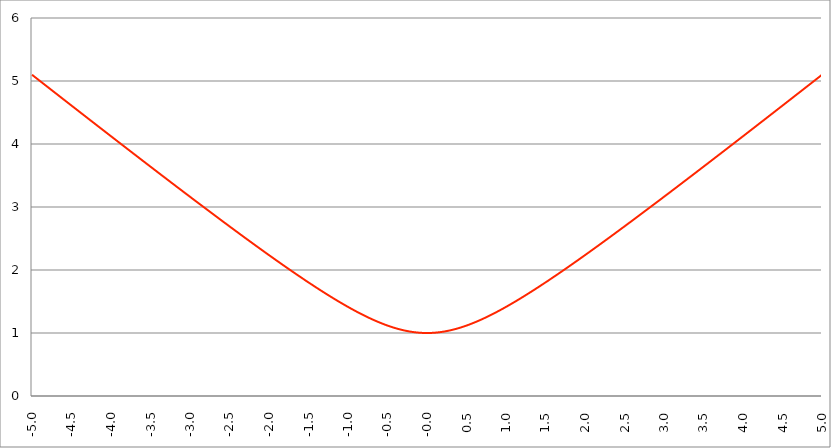
| Category | Series 1 |
|---|---|
| -5.0 | 5.099 |
| -4.995 | 5.094 |
| -4.99 | 5.089 |
| -4.985 | 5.084 |
| -4.98 | 5.079 |
| -4.975 | 5.075 |
| -4.97 | 5.07 |
| -4.965000000000001 | 5.065 |
| -4.960000000000001 | 5.06 |
| -4.955000000000001 | 5.055 |
| -4.950000000000001 | 5.05 |
| -4.945000000000001 | 5.045 |
| -4.940000000000001 | 5.04 |
| -4.935000000000001 | 5.035 |
| -4.930000000000001 | 5.03 |
| -4.925000000000002 | 5.025 |
| -4.920000000000002 | 5.021 |
| -4.915000000000002 | 5.016 |
| -4.910000000000002 | 5.011 |
| -4.905000000000002 | 5.006 |
| -4.900000000000002 | 5.001 |
| -4.895000000000002 | 4.996 |
| -4.890000000000002 | 4.991 |
| -4.885000000000002 | 4.986 |
| -4.880000000000002 | 4.981 |
| -4.875000000000003 | 4.977 |
| -4.870000000000003 | 4.972 |
| -4.865000000000003 | 4.967 |
| -4.860000000000003 | 4.962 |
| -4.855000000000003 | 4.957 |
| -4.850000000000003 | 4.952 |
| -4.845000000000003 | 4.947 |
| -4.840000000000003 | 4.942 |
| -4.835000000000003 | 4.937 |
| -4.830000000000004 | 4.932 |
| -4.825000000000004 | 4.928 |
| -4.820000000000004 | 4.923 |
| -4.815000000000004 | 4.918 |
| -4.810000000000004 | 4.913 |
| -4.805000000000004 | 4.908 |
| -4.800000000000004 | 4.903 |
| -4.795000000000004 | 4.898 |
| -4.790000000000004 | 4.893 |
| -4.785000000000004 | 4.888 |
| -4.780000000000004 | 4.883 |
| -4.775000000000004 | 4.879 |
| -4.770000000000004 | 4.874 |
| -4.765000000000005 | 4.869 |
| -4.760000000000005 | 4.864 |
| -4.755000000000005 | 4.859 |
| -4.750000000000005 | 4.854 |
| -4.745000000000005 | 4.849 |
| -4.740000000000005 | 4.844 |
| -4.735000000000005 | 4.839 |
| -4.730000000000005 | 4.835 |
| -4.725000000000006 | 4.83 |
| -4.720000000000006 | 4.825 |
| -4.715000000000006 | 4.82 |
| -4.710000000000006 | 4.815 |
| -4.705000000000006 | 4.81 |
| -4.700000000000006 | 4.805 |
| -4.695000000000006 | 4.8 |
| -4.690000000000006 | 4.795 |
| -4.685000000000007 | 4.791 |
| -4.680000000000007 | 4.786 |
| -4.675000000000007 | 4.781 |
| -4.670000000000007 | 4.776 |
| -4.665000000000007 | 4.771 |
| -4.660000000000007 | 4.766 |
| -4.655000000000007 | 4.761 |
| -4.650000000000007 | 4.756 |
| -4.645000000000007 | 4.751 |
| -4.640000000000008 | 4.747 |
| -4.635000000000008 | 4.742 |
| -4.630000000000008 | 4.737 |
| -4.625000000000008 | 4.732 |
| -4.620000000000008 | 4.727 |
| -4.615000000000008 | 4.722 |
| -4.610000000000008 | 4.717 |
| -4.605000000000008 | 4.712 |
| -4.600000000000008 | 4.707 |
| -4.595000000000009 | 4.703 |
| -4.590000000000009 | 4.698 |
| -4.585000000000009 | 4.693 |
| -4.580000000000009 | 4.688 |
| -4.57500000000001 | 4.683 |
| -4.57000000000001 | 4.678 |
| -4.565000000000009 | 4.673 |
| -4.560000000000009 | 4.668 |
| -4.555000000000009 | 4.663 |
| -4.55000000000001 | 4.659 |
| -4.54500000000001 | 4.654 |
| -4.54000000000001 | 4.649 |
| -4.53500000000001 | 4.644 |
| -4.53000000000001 | 4.639 |
| -4.52500000000001 | 4.634 |
| -4.52000000000001 | 4.629 |
| -4.51500000000001 | 4.624 |
| -4.51000000000001 | 4.62 |
| -4.505000000000011 | 4.615 |
| -4.500000000000011 | 4.61 |
| -4.495000000000011 | 4.605 |
| -4.490000000000011 | 4.6 |
| -4.485000000000011 | 4.595 |
| -4.480000000000011 | 4.59 |
| -4.475000000000011 | 4.585 |
| -4.470000000000011 | 4.58 |
| -4.465000000000011 | 4.576 |
| -4.460000000000011 | 4.571 |
| -4.455000000000012 | 4.566 |
| -4.450000000000012 | 4.561 |
| -4.445000000000012 | 4.556 |
| -4.440000000000012 | 4.551 |
| -4.435000000000012 | 4.546 |
| -4.430000000000012 | 4.541 |
| -4.425000000000012 | 4.537 |
| -4.420000000000012 | 4.532 |
| -4.415000000000012 | 4.527 |
| -4.410000000000013 | 4.522 |
| -4.405000000000013 | 4.517 |
| -4.400000000000013 | 4.512 |
| -4.395000000000013 | 4.507 |
| -4.390000000000013 | 4.502 |
| -4.385000000000013 | 4.498 |
| -4.380000000000013 | 4.493 |
| -4.375000000000013 | 4.488 |
| -4.370000000000013 | 4.483 |
| -4.365000000000013 | 4.478 |
| -4.360000000000014 | 4.473 |
| -4.355000000000014 | 4.468 |
| -4.350000000000014 | 4.463 |
| -4.345000000000014 | 4.459 |
| -4.340000000000014 | 4.454 |
| -4.335000000000014 | 4.449 |
| -4.330000000000014 | 4.444 |
| -4.325000000000014 | 4.439 |
| -4.320000000000014 | 4.434 |
| -4.315000000000015 | 4.429 |
| -4.310000000000015 | 4.424 |
| -4.305000000000015 | 4.42 |
| -4.300000000000015 | 4.415 |
| -4.295000000000015 | 4.41 |
| -4.290000000000015 | 4.405 |
| -4.285000000000015 | 4.4 |
| -4.280000000000015 | 4.395 |
| -4.275000000000015 | 4.39 |
| -4.270000000000015 | 4.386 |
| -4.265000000000016 | 4.381 |
| -4.260000000000016 | 4.376 |
| -4.255000000000016 | 4.371 |
| -4.250000000000016 | 4.366 |
| -4.245000000000016 | 4.361 |
| -4.240000000000016 | 4.356 |
| -4.235000000000016 | 4.351 |
| -4.230000000000016 | 4.347 |
| -4.225000000000017 | 4.342 |
| -4.220000000000017 | 4.337 |
| -4.215000000000017 | 4.332 |
| -4.210000000000017 | 4.327 |
| -4.205000000000017 | 4.322 |
| -4.200000000000017 | 4.317 |
| -4.195000000000017 | 4.313 |
| -4.190000000000017 | 4.308 |
| -4.185000000000017 | 4.303 |
| -4.180000000000017 | 4.298 |
| -4.175000000000018 | 4.293 |
| -4.170000000000018 | 4.288 |
| -4.165000000000018 | 4.283 |
| -4.160000000000018 | 4.279 |
| -4.155000000000018 | 4.274 |
| -4.150000000000018 | 4.269 |
| -4.145000000000018 | 4.264 |
| -4.140000000000018 | 4.259 |
| -4.135000000000018 | 4.254 |
| -4.130000000000019 | 4.249 |
| -4.125000000000019 | 4.244 |
| -4.120000000000019 | 4.24 |
| -4.115000000000019 | 4.235 |
| -4.110000000000019 | 4.23 |
| -4.105000000000019 | 4.225 |
| -4.100000000000019 | 4.22 |
| -4.095000000000019 | 4.215 |
| -4.090000000000019 | 4.21 |
| -4.085000000000019 | 4.206 |
| -4.08000000000002 | 4.201 |
| -4.07500000000002 | 4.196 |
| -4.07000000000002 | 4.191 |
| -4.06500000000002 | 4.186 |
| -4.06000000000002 | 4.181 |
| -4.05500000000002 | 4.176 |
| -4.05000000000002 | 4.172 |
| -4.04500000000002 | 4.167 |
| -4.04000000000002 | 4.162 |
| -4.03500000000002 | 4.157 |
| -4.03000000000002 | 4.152 |
| -4.025000000000021 | 4.147 |
| -4.020000000000021 | 4.143 |
| -4.015000000000021 | 4.138 |
| -4.010000000000021 | 4.133 |
| -4.005000000000021 | 4.128 |
| -4.000000000000021 | 4.123 |
| -3.995000000000021 | 4.118 |
| -3.990000000000021 | 4.113 |
| -3.985000000000022 | 4.109 |
| -3.980000000000022 | 4.104 |
| -3.975000000000022 | 4.099 |
| -3.970000000000022 | 4.094 |
| -3.965000000000022 | 4.089 |
| -3.960000000000022 | 4.084 |
| -3.955000000000022 | 4.079 |
| -3.950000000000022 | 4.075 |
| -3.945000000000022 | 4.07 |
| -3.940000000000023 | 4.065 |
| -3.935000000000023 | 4.06 |
| -3.930000000000023 | 4.055 |
| -3.925000000000023 | 4.05 |
| -3.920000000000023 | 4.046 |
| -3.915000000000023 | 4.041 |
| -3.910000000000023 | 4.036 |
| -3.905000000000023 | 4.031 |
| -3.900000000000023 | 4.026 |
| -3.895000000000023 | 4.021 |
| -3.890000000000024 | 4.016 |
| -3.885000000000024 | 4.012 |
| -3.880000000000024 | 4.007 |
| -3.875000000000024 | 4.002 |
| -3.870000000000024 | 3.997 |
| -3.865000000000024 | 3.992 |
| -3.860000000000024 | 3.987 |
| -3.855000000000024 | 3.983 |
| -3.850000000000024 | 3.978 |
| -3.845000000000025 | 3.973 |
| -3.840000000000025 | 3.968 |
| -3.835000000000025 | 3.963 |
| -3.830000000000025 | 3.958 |
| -3.825000000000025 | 3.954 |
| -3.820000000000025 | 3.949 |
| -3.815000000000025 | 3.944 |
| -3.810000000000025 | 3.939 |
| -3.805000000000025 | 3.934 |
| -3.800000000000026 | 3.929 |
| -3.795000000000026 | 3.925 |
| -3.790000000000026 | 3.92 |
| -3.785000000000026 | 3.915 |
| -3.780000000000026 | 3.91 |
| -3.775000000000026 | 3.905 |
| -3.770000000000026 | 3.9 |
| -3.765000000000026 | 3.896 |
| -3.760000000000026 | 3.891 |
| -3.755000000000026 | 3.886 |
| -3.750000000000027 | 3.881 |
| -3.745000000000027 | 3.876 |
| -3.740000000000027 | 3.871 |
| -3.735000000000027 | 3.867 |
| -3.730000000000027 | 3.862 |
| -3.725000000000027 | 3.857 |
| -3.720000000000027 | 3.852 |
| -3.715000000000027 | 3.847 |
| -3.710000000000027 | 3.842 |
| -3.705000000000028 | 3.838 |
| -3.700000000000028 | 3.833 |
| -3.695000000000028 | 3.828 |
| -3.690000000000028 | 3.823 |
| -3.685000000000028 | 3.818 |
| -3.680000000000028 | 3.813 |
| -3.675000000000028 | 3.809 |
| -3.670000000000028 | 3.804 |
| -3.665000000000028 | 3.799 |
| -3.660000000000028 | 3.794 |
| -3.655000000000029 | 3.789 |
| -3.650000000000029 | 3.785 |
| -3.645000000000029 | 3.78 |
| -3.640000000000029 | 3.775 |
| -3.635000000000029 | 3.77 |
| -3.630000000000029 | 3.765 |
| -3.625000000000029 | 3.76 |
| -3.620000000000029 | 3.756 |
| -3.615000000000029 | 3.751 |
| -3.61000000000003 | 3.746 |
| -3.60500000000003 | 3.741 |
| -3.60000000000003 | 3.736 |
| -3.59500000000003 | 3.731 |
| -3.59000000000003 | 3.727 |
| -3.58500000000003 | 3.722 |
| -3.58000000000003 | 3.717 |
| -3.57500000000003 | 3.712 |
| -3.57000000000003 | 3.707 |
| -3.565000000000031 | 3.703 |
| -3.560000000000031 | 3.698 |
| -3.555000000000031 | 3.693 |
| -3.550000000000031 | 3.688 |
| -3.545000000000031 | 3.683 |
| -3.540000000000031 | 3.679 |
| -3.535000000000031 | 3.674 |
| -3.530000000000031 | 3.669 |
| -3.525000000000031 | 3.664 |
| -3.520000000000032 | 3.659 |
| -3.515000000000032 | 3.654 |
| -3.510000000000032 | 3.65 |
| -3.505000000000032 | 3.645 |
| -3.500000000000032 | 3.64 |
| -3.495000000000032 | 3.635 |
| -3.490000000000032 | 3.63 |
| -3.485000000000032 | 3.626 |
| -3.480000000000032 | 3.621 |
| -3.475000000000032 | 3.616 |
| -3.470000000000033 | 3.611 |
| -3.465000000000033 | 3.606 |
| -3.460000000000033 | 3.602 |
| -3.455000000000033 | 3.597 |
| -3.450000000000033 | 3.592 |
| -3.445000000000033 | 3.587 |
| -3.440000000000033 | 3.582 |
| -3.435000000000033 | 3.578 |
| -3.430000000000033 | 3.573 |
| -3.425000000000034 | 3.568 |
| -3.420000000000034 | 3.563 |
| -3.415000000000034 | 3.558 |
| -3.410000000000034 | 3.554 |
| -3.405000000000034 | 3.549 |
| -3.400000000000034 | 3.544 |
| -3.395000000000034 | 3.539 |
| -3.390000000000034 | 3.534 |
| -3.385000000000034 | 3.53 |
| -3.380000000000034 | 3.525 |
| -3.375000000000035 | 3.52 |
| -3.370000000000035 | 3.515 |
| -3.365000000000035 | 3.51 |
| -3.360000000000035 | 3.506 |
| -3.355000000000035 | 3.501 |
| -3.350000000000035 | 3.496 |
| -3.345000000000035 | 3.491 |
| -3.340000000000035 | 3.486 |
| -3.335000000000035 | 3.482 |
| -3.330000000000036 | 3.477 |
| -3.325000000000036 | 3.472 |
| -3.320000000000036 | 3.467 |
| -3.315000000000036 | 3.463 |
| -3.310000000000036 | 3.458 |
| -3.305000000000036 | 3.453 |
| -3.300000000000036 | 3.448 |
| -3.295000000000036 | 3.443 |
| -3.290000000000036 | 3.439 |
| -3.285000000000036 | 3.434 |
| -3.280000000000036 | 3.429 |
| -3.275000000000037 | 3.424 |
| -3.270000000000037 | 3.419 |
| -3.265000000000037 | 3.415 |
| -3.260000000000037 | 3.41 |
| -3.255000000000037 | 3.405 |
| -3.250000000000037 | 3.4 |
| -3.245000000000037 | 3.396 |
| -3.240000000000037 | 3.391 |
| -3.235000000000038 | 3.386 |
| -3.230000000000038 | 3.381 |
| -3.225000000000038 | 3.376 |
| -3.220000000000038 | 3.372 |
| -3.215000000000038 | 3.367 |
| -3.210000000000038 | 3.362 |
| -3.205000000000038 | 3.357 |
| -3.200000000000038 | 3.353 |
| -3.195000000000038 | 3.348 |
| -3.190000000000039 | 3.343 |
| -3.185000000000039 | 3.338 |
| -3.180000000000039 | 3.334 |
| -3.175000000000039 | 3.329 |
| -3.170000000000039 | 3.324 |
| -3.16500000000004 | 3.319 |
| -3.16000000000004 | 3.314 |
| -3.155000000000039 | 3.31 |
| -3.150000000000039 | 3.305 |
| -3.14500000000004 | 3.3 |
| -3.14000000000004 | 3.295 |
| -3.13500000000004 | 3.291 |
| -3.13000000000004 | 3.286 |
| -3.12500000000004 | 3.281 |
| -3.12000000000004 | 3.276 |
| -3.11500000000004 | 3.272 |
| -3.11000000000004 | 3.267 |
| -3.10500000000004 | 3.262 |
| -3.10000000000004 | 3.257 |
| -3.095000000000041 | 3.253 |
| -3.090000000000041 | 3.248 |
| -3.085000000000041 | 3.243 |
| -3.080000000000041 | 3.238 |
| -3.075000000000041 | 3.234 |
| -3.070000000000041 | 3.229 |
| -3.065000000000041 | 3.224 |
| -3.060000000000041 | 3.219 |
| -3.055000000000041 | 3.215 |
| -3.050000000000042 | 3.21 |
| -3.045000000000042 | 3.205 |
| -3.040000000000042 | 3.2 |
| -3.035000000000042 | 3.196 |
| -3.030000000000042 | 3.191 |
| -3.025000000000042 | 3.186 |
| -3.020000000000042 | 3.181 |
| -3.015000000000042 | 3.177 |
| -3.010000000000042 | 3.172 |
| -3.005000000000043 | 3.167 |
| -3.000000000000043 | 3.162 |
| -2.995000000000043 | 3.158 |
| -2.990000000000043 | 3.153 |
| -2.985000000000043 | 3.148 |
| -2.980000000000043 | 3.143 |
| -2.975000000000043 | 3.139 |
| -2.970000000000043 | 3.134 |
| -2.965000000000043 | 3.129 |
| -2.960000000000043 | 3.124 |
| -2.955000000000044 | 3.12 |
| -2.950000000000044 | 3.115 |
| -2.945000000000044 | 3.11 |
| -2.940000000000044 | 3.105 |
| -2.935000000000044 | 3.101 |
| -2.930000000000044 | 3.096 |
| -2.925000000000044 | 3.091 |
| -2.920000000000044 | 3.086 |
| -2.915000000000044 | 3.082 |
| -2.910000000000045 | 3.077 |
| -2.905000000000045 | 3.072 |
| -2.900000000000045 | 3.068 |
| -2.895000000000045 | 3.063 |
| -2.890000000000045 | 3.058 |
| -2.885000000000045 | 3.053 |
| -2.880000000000045 | 3.049 |
| -2.875000000000045 | 3.044 |
| -2.870000000000045 | 3.039 |
| -2.865000000000045 | 3.035 |
| -2.860000000000046 | 3.03 |
| -2.855000000000046 | 3.025 |
| -2.850000000000046 | 3.02 |
| -2.845000000000046 | 3.016 |
| -2.840000000000046 | 3.011 |
| -2.835000000000046 | 3.006 |
| -2.830000000000046 | 3.001 |
| -2.825000000000046 | 2.997 |
| -2.820000000000046 | 2.992 |
| -2.815000000000047 | 2.987 |
| -2.810000000000047 | 2.983 |
| -2.805000000000047 | 2.978 |
| -2.800000000000047 | 2.973 |
| -2.795000000000047 | 2.969 |
| -2.790000000000047 | 2.964 |
| -2.785000000000047 | 2.959 |
| -2.780000000000047 | 2.954 |
| -2.775000000000047 | 2.95 |
| -2.770000000000047 | 2.945 |
| -2.765000000000048 | 2.94 |
| -2.760000000000048 | 2.936 |
| -2.755000000000048 | 2.931 |
| -2.750000000000048 | 2.926 |
| -2.745000000000048 | 2.921 |
| -2.740000000000048 | 2.917 |
| -2.735000000000048 | 2.912 |
| -2.730000000000048 | 2.907 |
| -2.725000000000048 | 2.903 |
| -2.720000000000049 | 2.898 |
| -2.715000000000049 | 2.893 |
| -2.710000000000049 | 2.889 |
| -2.705000000000049 | 2.884 |
| -2.700000000000049 | 2.879 |
| -2.695000000000049 | 2.875 |
| -2.690000000000049 | 2.87 |
| -2.685000000000049 | 2.865 |
| -2.680000000000049 | 2.86 |
| -2.675000000000049 | 2.856 |
| -2.67000000000005 | 2.851 |
| -2.66500000000005 | 2.846 |
| -2.66000000000005 | 2.842 |
| -2.65500000000005 | 2.837 |
| -2.65000000000005 | 2.832 |
| -2.64500000000005 | 2.828 |
| -2.64000000000005 | 2.823 |
| -2.63500000000005 | 2.818 |
| -2.63000000000005 | 2.814 |
| -2.625000000000051 | 2.809 |
| -2.620000000000051 | 2.804 |
| -2.615000000000051 | 2.8 |
| -2.610000000000051 | 2.795 |
| -2.605000000000051 | 2.79 |
| -2.600000000000051 | 2.786 |
| -2.595000000000051 | 2.781 |
| -2.590000000000051 | 2.776 |
| -2.585000000000051 | 2.772 |
| -2.580000000000052 | 2.767 |
| -2.575000000000052 | 2.762 |
| -2.570000000000052 | 2.758 |
| -2.565000000000052 | 2.753 |
| -2.560000000000052 | 2.748 |
| -2.555000000000052 | 2.744 |
| -2.550000000000052 | 2.739 |
| -2.545000000000052 | 2.734 |
| -2.540000000000052 | 2.73 |
| -2.535000000000053 | 2.725 |
| -2.530000000000053 | 2.72 |
| -2.525000000000053 | 2.716 |
| -2.520000000000053 | 2.711 |
| -2.515000000000053 | 2.707 |
| -2.510000000000053 | 2.702 |
| -2.505000000000053 | 2.697 |
| -2.500000000000053 | 2.693 |
| -2.495000000000053 | 2.688 |
| -2.490000000000053 | 2.683 |
| -2.485000000000054 | 2.679 |
| -2.480000000000054 | 2.674 |
| -2.475000000000054 | 2.669 |
| -2.470000000000054 | 2.665 |
| -2.465000000000054 | 2.66 |
| -2.460000000000054 | 2.655 |
| -2.455000000000054 | 2.651 |
| -2.450000000000054 | 2.646 |
| -2.445000000000054 | 2.642 |
| -2.440000000000055 | 2.637 |
| -2.435000000000055 | 2.632 |
| -2.430000000000055 | 2.628 |
| -2.425000000000055 | 2.623 |
| -2.420000000000055 | 2.618 |
| -2.415000000000055 | 2.614 |
| -2.410000000000055 | 2.609 |
| -2.405000000000055 | 2.605 |
| -2.400000000000055 | 2.6 |
| -2.395000000000055 | 2.595 |
| -2.390000000000056 | 2.591 |
| -2.385000000000056 | 2.586 |
| -2.380000000000056 | 2.582 |
| -2.375000000000056 | 2.577 |
| -2.370000000000056 | 2.572 |
| -2.365000000000056 | 2.568 |
| -2.360000000000056 | 2.563 |
| -2.355000000000056 | 2.559 |
| -2.350000000000056 | 2.554 |
| -2.345000000000057 | 2.549 |
| -2.340000000000057 | 2.545 |
| -2.335000000000057 | 2.54 |
| -2.330000000000057 | 2.536 |
| -2.325000000000057 | 2.531 |
| -2.320000000000057 | 2.526 |
| -2.315000000000057 | 2.522 |
| -2.310000000000057 | 2.517 |
| -2.305000000000057 | 2.513 |
| -2.300000000000058 | 2.508 |
| -2.295000000000058 | 2.503 |
| -2.290000000000058 | 2.499 |
| -2.285000000000058 | 2.494 |
| -2.280000000000058 | 2.49 |
| -2.275000000000058 | 2.485 |
| -2.270000000000058 | 2.481 |
| -2.265000000000058 | 2.476 |
| -2.260000000000058 | 2.471 |
| -2.255000000000058 | 2.467 |
| -2.250000000000059 | 2.462 |
| -2.245000000000059 | 2.458 |
| -2.240000000000059 | 2.453 |
| -2.235000000000059 | 2.449 |
| -2.23000000000006 | 2.444 |
| -2.22500000000006 | 2.439 |
| -2.22000000000006 | 2.435 |
| -2.215000000000059 | 2.43 |
| -2.210000000000059 | 2.426 |
| -2.20500000000006 | 2.421 |
| -2.20000000000006 | 2.417 |
| -2.19500000000006 | 2.412 |
| -2.19000000000006 | 2.408 |
| -2.18500000000006 | 2.403 |
| -2.18000000000006 | 2.398 |
| -2.17500000000006 | 2.394 |
| -2.17000000000006 | 2.389 |
| -2.16500000000006 | 2.385 |
| -2.160000000000061 | 2.38 |
| -2.155000000000061 | 2.376 |
| -2.150000000000061 | 2.371 |
| -2.145000000000061 | 2.367 |
| -2.140000000000061 | 2.362 |
| -2.135000000000061 | 2.358 |
| -2.130000000000061 | 2.353 |
| -2.125000000000061 | 2.349 |
| -2.120000000000061 | 2.344 |
| -2.115000000000061 | 2.339 |
| -2.110000000000062 | 2.335 |
| -2.105000000000062 | 2.33 |
| -2.100000000000062 | 2.326 |
| -2.095000000000062 | 2.321 |
| -2.090000000000062 | 2.317 |
| -2.085000000000062 | 2.312 |
| -2.080000000000062 | 2.308 |
| -2.075000000000062 | 2.303 |
| -2.070000000000062 | 2.299 |
| -2.065000000000063 | 2.294 |
| -2.060000000000063 | 2.29 |
| -2.055000000000063 | 2.285 |
| -2.050000000000063 | 2.281 |
| -2.045000000000063 | 2.276 |
| -2.040000000000063 | 2.272 |
| -2.035000000000063 | 2.267 |
| -2.030000000000063 | 2.263 |
| -2.025000000000063 | 2.258 |
| -2.020000000000064 | 2.254 |
| -2.015000000000064 | 2.249 |
| -2.010000000000064 | 2.245 |
| -2.005000000000064 | 2.241 |
| -2.000000000000064 | 2.236 |
| -1.995000000000064 | 2.232 |
| -1.990000000000064 | 2.227 |
| -1.985000000000064 | 2.223 |
| -1.980000000000064 | 2.218 |
| -1.975000000000064 | 2.214 |
| -1.970000000000065 | 2.209 |
| -1.965000000000065 | 2.205 |
| -1.960000000000065 | 2.2 |
| -1.955000000000065 | 2.196 |
| -1.950000000000065 | 2.191 |
| -1.945000000000065 | 2.187 |
| -1.940000000000065 | 2.183 |
| -1.935000000000065 | 2.178 |
| -1.930000000000065 | 2.174 |
| -1.925000000000066 | 2.169 |
| -1.920000000000066 | 2.165 |
| -1.915000000000066 | 2.16 |
| -1.910000000000066 | 2.156 |
| -1.905000000000066 | 2.152 |
| -1.900000000000066 | 2.147 |
| -1.895000000000066 | 2.143 |
| -1.890000000000066 | 2.138 |
| -1.885000000000066 | 2.134 |
| -1.880000000000066 | 2.129 |
| -1.875000000000067 | 2.125 |
| -1.870000000000067 | 2.121 |
| -1.865000000000067 | 2.116 |
| -1.860000000000067 | 2.112 |
| -1.855000000000067 | 2.107 |
| -1.850000000000067 | 2.103 |
| -1.845000000000067 | 2.099 |
| -1.840000000000067 | 2.094 |
| -1.835000000000067 | 2.09 |
| -1.830000000000068 | 2.085 |
| -1.825000000000068 | 2.081 |
| -1.820000000000068 | 2.077 |
| -1.815000000000068 | 2.072 |
| -1.810000000000068 | 2.068 |
| -1.805000000000068 | 2.063 |
| -1.800000000000068 | 2.059 |
| -1.795000000000068 | 2.055 |
| -1.790000000000068 | 2.05 |
| -1.785000000000068 | 2.046 |
| -1.780000000000069 | 2.042 |
| -1.775000000000069 | 2.037 |
| -1.770000000000069 | 2.033 |
| -1.765000000000069 | 2.029 |
| -1.760000000000069 | 2.024 |
| -1.75500000000007 | 2.02 |
| -1.75000000000007 | 2.016 |
| -1.745000000000069 | 2.011 |
| -1.740000000000069 | 2.007 |
| -1.73500000000007 | 2.003 |
| -1.73000000000007 | 1.998 |
| -1.72500000000007 | 1.994 |
| -1.72000000000007 | 1.99 |
| -1.71500000000007 | 1.985 |
| -1.71000000000007 | 1.981 |
| -1.70500000000007 | 1.977 |
| -1.70000000000007 | 1.972 |
| -1.69500000000007 | 1.968 |
| -1.69000000000007 | 1.964 |
| -1.685000000000071 | 1.959 |
| -1.680000000000071 | 1.955 |
| -1.675000000000071 | 1.951 |
| -1.670000000000071 | 1.947 |
| -1.665000000000071 | 1.942 |
| -1.660000000000071 | 1.938 |
| -1.655000000000071 | 1.934 |
| -1.650000000000071 | 1.929 |
| -1.645000000000071 | 1.925 |
| -1.640000000000072 | 1.921 |
| -1.635000000000072 | 1.917 |
| -1.630000000000072 | 1.912 |
| -1.625000000000072 | 1.908 |
| -1.620000000000072 | 1.904 |
| -1.615000000000072 | 1.9 |
| -1.610000000000072 | 1.895 |
| -1.605000000000072 | 1.891 |
| -1.600000000000072 | 1.887 |
| -1.595000000000073 | 1.883 |
| -1.590000000000073 | 1.878 |
| -1.585000000000073 | 1.874 |
| -1.580000000000073 | 1.87 |
| -1.575000000000073 | 1.866 |
| -1.570000000000073 | 1.861 |
| -1.565000000000073 | 1.857 |
| -1.560000000000073 | 1.853 |
| -1.555000000000073 | 1.849 |
| -1.550000000000074 | 1.845 |
| -1.545000000000074 | 1.84 |
| -1.540000000000074 | 1.836 |
| -1.535000000000074 | 1.832 |
| -1.530000000000074 | 1.828 |
| -1.525000000000074 | 1.824 |
| -1.520000000000074 | 1.819 |
| -1.515000000000074 | 1.815 |
| -1.510000000000074 | 1.811 |
| -1.505000000000074 | 1.807 |
| -1.500000000000075 | 1.803 |
| -1.495000000000075 | 1.799 |
| -1.490000000000075 | 1.794 |
| -1.485000000000075 | 1.79 |
| -1.480000000000075 | 1.786 |
| -1.475000000000075 | 1.782 |
| -1.470000000000075 | 1.778 |
| -1.465000000000075 | 1.774 |
| -1.460000000000075 | 1.77 |
| -1.455000000000076 | 1.766 |
| -1.450000000000076 | 1.761 |
| -1.445000000000076 | 1.757 |
| -1.440000000000076 | 1.753 |
| -1.435000000000076 | 1.749 |
| -1.430000000000076 | 1.745 |
| -1.425000000000076 | 1.741 |
| -1.420000000000076 | 1.737 |
| -1.415000000000076 | 1.733 |
| -1.410000000000077 | 1.729 |
| -1.405000000000077 | 1.725 |
| -1.400000000000077 | 1.72 |
| -1.395000000000077 | 1.716 |
| -1.390000000000077 | 1.712 |
| -1.385000000000077 | 1.708 |
| -1.380000000000077 | 1.704 |
| -1.375000000000077 | 1.7 |
| -1.370000000000077 | 1.696 |
| -1.365000000000077 | 1.692 |
| -1.360000000000078 | 1.688 |
| -1.355000000000078 | 1.684 |
| -1.350000000000078 | 1.68 |
| -1.345000000000078 | 1.676 |
| -1.340000000000078 | 1.672 |
| -1.335000000000078 | 1.668 |
| -1.330000000000078 | 1.664 |
| -1.325000000000078 | 1.66 |
| -1.320000000000078 | 1.656 |
| -1.315000000000079 | 1.652 |
| -1.310000000000079 | 1.648 |
| -1.305000000000079 | 1.644 |
| -1.300000000000079 | 1.64 |
| -1.295000000000079 | 1.636 |
| -1.29000000000008 | 1.632 |
| -1.285000000000079 | 1.628 |
| -1.280000000000079 | 1.624 |
| -1.275000000000079 | 1.62 |
| -1.270000000000079 | 1.616 |
| -1.26500000000008 | 1.613 |
| -1.26000000000008 | 1.609 |
| -1.25500000000008 | 1.605 |
| -1.25000000000008 | 1.601 |
| -1.24500000000008 | 1.597 |
| -1.24000000000008 | 1.593 |
| -1.23500000000008 | 1.589 |
| -1.23000000000008 | 1.585 |
| -1.22500000000008 | 1.581 |
| -1.220000000000081 | 1.577 |
| -1.215000000000081 | 1.574 |
| -1.210000000000081 | 1.57 |
| -1.205000000000081 | 1.566 |
| -1.200000000000081 | 1.562 |
| -1.195000000000081 | 1.558 |
| -1.190000000000081 | 1.554 |
| -1.185000000000081 | 1.551 |
| -1.180000000000081 | 1.547 |
| -1.175000000000082 | 1.543 |
| -1.170000000000082 | 1.539 |
| -1.165000000000082 | 1.535 |
| -1.160000000000082 | 1.532 |
| -1.155000000000082 | 1.528 |
| -1.150000000000082 | 1.524 |
| -1.145000000000082 | 1.52 |
| -1.140000000000082 | 1.516 |
| -1.135000000000082 | 1.513 |
| -1.130000000000082 | 1.509 |
| -1.125000000000083 | 1.505 |
| -1.120000000000083 | 1.501 |
| -1.115000000000083 | 1.498 |
| -1.110000000000083 | 1.494 |
| -1.105000000000083 | 1.49 |
| -1.100000000000083 | 1.487 |
| -1.095000000000083 | 1.483 |
| -1.090000000000083 | 1.479 |
| -1.085000000000083 | 1.476 |
| -1.080000000000084 | 1.472 |
| -1.075000000000084 | 1.468 |
| -1.070000000000084 | 1.465 |
| -1.065000000000084 | 1.461 |
| -1.060000000000084 | 1.457 |
| -1.055000000000084 | 1.454 |
| -1.050000000000084 | 1.45 |
| -1.045000000000084 | 1.446 |
| -1.040000000000084 | 1.443 |
| -1.035000000000085 | 1.439 |
| -1.030000000000085 | 1.436 |
| -1.025000000000085 | 1.432 |
| -1.020000000000085 | 1.428 |
| -1.015000000000085 | 1.425 |
| -1.010000000000085 | 1.421 |
| -1.005000000000085 | 1.418 |
| -1.000000000000085 | 1.414 |
| -0.995000000000085 | 1.411 |
| -0.990000000000085 | 1.407 |
| -0.985000000000085 | 1.404 |
| -0.980000000000085 | 1.4 |
| -0.975000000000085 | 1.397 |
| -0.970000000000085 | 1.393 |
| -0.965000000000085 | 1.39 |
| -0.960000000000085 | 1.386 |
| -0.955000000000085 | 1.383 |
| -0.950000000000085 | 1.379 |
| -0.945000000000085 | 1.376 |
| -0.940000000000085 | 1.372 |
| -0.935000000000085 | 1.369 |
| -0.930000000000085 | 1.366 |
| -0.925000000000085 | 1.362 |
| -0.920000000000085 | 1.359 |
| -0.915000000000085 | 1.355 |
| -0.910000000000085 | 1.352 |
| -0.905000000000085 | 1.349 |
| -0.900000000000085 | 1.345 |
| -0.895000000000085 | 1.342 |
| -0.890000000000085 | 1.339 |
| -0.885000000000085 | 1.335 |
| -0.880000000000085 | 1.332 |
| -0.875000000000085 | 1.329 |
| -0.870000000000085 | 1.325 |
| -0.865000000000085 | 1.322 |
| -0.860000000000085 | 1.319 |
| -0.855000000000085 | 1.316 |
| -0.850000000000085 | 1.312 |
| -0.845000000000085 | 1.309 |
| -0.840000000000085 | 1.306 |
| -0.835000000000085 | 1.303 |
| -0.830000000000085 | 1.3 |
| -0.825000000000085 | 1.296 |
| -0.820000000000085 | 1.293 |
| -0.815000000000085 | 1.29 |
| -0.810000000000085 | 1.287 |
| -0.805000000000085 | 1.284 |
| -0.800000000000085 | 1.281 |
| -0.795000000000085 | 1.278 |
| -0.790000000000085 | 1.274 |
| -0.785000000000085 | 1.271 |
| -0.780000000000085 | 1.268 |
| -0.775000000000085 | 1.265 |
| -0.770000000000085 | 1.262 |
| -0.765000000000085 | 1.259 |
| -0.760000000000085 | 1.256 |
| -0.755000000000085 | 1.253 |
| -0.750000000000085 | 1.25 |
| -0.745000000000085 | 1.247 |
| -0.740000000000085 | 1.244 |
| -0.735000000000085 | 1.241 |
| -0.730000000000085 | 1.238 |
| -0.725000000000085 | 1.235 |
| -0.720000000000085 | 1.232 |
| -0.715000000000085 | 1.229 |
| -0.710000000000085 | 1.226 |
| -0.705000000000085 | 1.224 |
| -0.700000000000085 | 1.221 |
| -0.695000000000085 | 1.218 |
| -0.690000000000085 | 1.215 |
| -0.685000000000085 | 1.212 |
| -0.680000000000085 | 1.209 |
| -0.675000000000085 | 1.206 |
| -0.670000000000085 | 1.204 |
| -0.665000000000085 | 1.201 |
| -0.660000000000085 | 1.198 |
| -0.655000000000085 | 1.195 |
| -0.650000000000085 | 1.193 |
| -0.645000000000085 | 1.19 |
| -0.640000000000085 | 1.187 |
| -0.635000000000085 | 1.185 |
| -0.630000000000085 | 1.182 |
| -0.625000000000085 | 1.179 |
| -0.620000000000085 | 1.177 |
| -0.615000000000085 | 1.174 |
| -0.610000000000085 | 1.171 |
| -0.605000000000085 | 1.169 |
| -0.600000000000085 | 1.166 |
| -0.595000000000085 | 1.164 |
| -0.590000000000085 | 1.161 |
| -0.585000000000085 | 1.159 |
| -0.580000000000085 | 1.156 |
| -0.575000000000085 | 1.154 |
| -0.570000000000085 | 1.151 |
| -0.565000000000085 | 1.149 |
| -0.560000000000085 | 1.146 |
| -0.555000000000085 | 1.144 |
| -0.550000000000085 | 1.141 |
| -0.545000000000085 | 1.139 |
| -0.540000000000085 | 1.136 |
| -0.535000000000085 | 1.134 |
| -0.530000000000085 | 1.132 |
| -0.525000000000085 | 1.129 |
| -0.520000000000085 | 1.127 |
| -0.515000000000085 | 1.125 |
| -0.510000000000085 | 1.123 |
| -0.505000000000085 | 1.12 |
| -0.500000000000085 | 1.118 |
| -0.495000000000085 | 1.116 |
| -0.490000000000085 | 1.114 |
| -0.485000000000085 | 1.111 |
| -0.480000000000085 | 1.109 |
| -0.475000000000085 | 1.107 |
| -0.470000000000085 | 1.105 |
| -0.465000000000085 | 1.103 |
| -0.460000000000085 | 1.101 |
| -0.455000000000085 | 1.099 |
| -0.450000000000085 | 1.097 |
| -0.445000000000085 | 1.095 |
| -0.440000000000085 | 1.093 |
| -0.435000000000085 | 1.091 |
| -0.430000000000085 | 1.089 |
| -0.425000000000085 | 1.087 |
| -0.420000000000085 | 1.085 |
| -0.415000000000085 | 1.083 |
| -0.410000000000085 | 1.081 |
| -0.405000000000085 | 1.079 |
| -0.400000000000085 | 1.077 |
| -0.395000000000085 | 1.075 |
| -0.390000000000085 | 1.073 |
| -0.385000000000085 | 1.072 |
| -0.380000000000085 | 1.07 |
| -0.375000000000085 | 1.068 |
| -0.370000000000085 | 1.066 |
| -0.365000000000085 | 1.065 |
| -0.360000000000085 | 1.063 |
| -0.355000000000085 | 1.061 |
| -0.350000000000085 | 1.059 |
| -0.345000000000085 | 1.058 |
| -0.340000000000085 | 1.056 |
| -0.335000000000085 | 1.055 |
| -0.330000000000085 | 1.053 |
| -0.325000000000085 | 1.051 |
| -0.320000000000085 | 1.05 |
| -0.315000000000085 | 1.048 |
| -0.310000000000085 | 1.047 |
| -0.305000000000085 | 1.045 |
| -0.300000000000085 | 1.044 |
| -0.295000000000085 | 1.043 |
| -0.290000000000085 | 1.041 |
| -0.285000000000085 | 1.04 |
| -0.280000000000085 | 1.038 |
| -0.275000000000085 | 1.037 |
| -0.270000000000085 | 1.036 |
| -0.265000000000085 | 1.035 |
| -0.260000000000085 | 1.033 |
| -0.255000000000085 | 1.032 |
| -0.250000000000085 | 1.031 |
| -0.245000000000085 | 1.03 |
| -0.240000000000085 | 1.028 |
| -0.235000000000085 | 1.027 |
| -0.230000000000085 | 1.026 |
| -0.225000000000085 | 1.025 |
| -0.220000000000085 | 1.024 |
| -0.215000000000085 | 1.023 |
| -0.210000000000085 | 1.022 |
| -0.205000000000085 | 1.021 |
| -0.200000000000085 | 1.02 |
| -0.195000000000085 | 1.019 |
| -0.190000000000085 | 1.018 |
| -0.185000000000085 | 1.017 |
| -0.180000000000085 | 1.016 |
| -0.175000000000085 | 1.015 |
| -0.170000000000085 | 1.014 |
| -0.165000000000085 | 1.014 |
| -0.160000000000085 | 1.013 |
| -0.155000000000084 | 1.012 |
| -0.150000000000084 | 1.011 |
| -0.145000000000084 | 1.01 |
| -0.140000000000084 | 1.01 |
| -0.135000000000084 | 1.009 |
| -0.130000000000084 | 1.008 |
| -0.125000000000084 | 1.008 |
| -0.120000000000084 | 1.007 |
| -0.115000000000084 | 1.007 |
| -0.110000000000084 | 1.006 |
| -0.105000000000084 | 1.005 |
| -0.100000000000084 | 1.005 |
| -0.0950000000000844 | 1.005 |
| -0.0900000000000844 | 1.004 |
| -0.0850000000000844 | 1.004 |
| -0.0800000000000844 | 1.003 |
| -0.0750000000000844 | 1.003 |
| -0.0700000000000844 | 1.002 |
| -0.0650000000000844 | 1.002 |
| -0.0600000000000844 | 1.002 |
| -0.0550000000000844 | 1.002 |
| -0.0500000000000844 | 1.001 |
| -0.0450000000000844 | 1.001 |
| -0.0400000000000844 | 1.001 |
| -0.0350000000000844 | 1.001 |
| -0.0300000000000844 | 1 |
| -0.0250000000000844 | 1 |
| -0.0200000000000844 | 1 |
| -0.0150000000000844 | 1 |
| -0.0100000000000844 | 1 |
| -0.00500000000008444 | 1 |
| -8.4444604087075e-14 | 1 |
| 0.00499999999991555 | 1 |
| 0.00999999999991555 | 1 |
| 0.0149999999999156 | 1 |
| 0.0199999999999156 | 1 |
| 0.0249999999999156 | 1 |
| 0.0299999999999156 | 1 |
| 0.0349999999999155 | 1.001 |
| 0.0399999999999155 | 1.001 |
| 0.0449999999999155 | 1.001 |
| 0.0499999999999155 | 1.001 |
| 0.0549999999999155 | 1.002 |
| 0.0599999999999155 | 1.002 |
| 0.0649999999999155 | 1.002 |
| 0.0699999999999155 | 1.002 |
| 0.0749999999999155 | 1.003 |
| 0.0799999999999155 | 1.003 |
| 0.0849999999999155 | 1.004 |
| 0.0899999999999155 | 1.004 |
| 0.0949999999999155 | 1.005 |
| 0.0999999999999155 | 1.005 |
| 0.104999999999916 | 1.005 |
| 0.109999999999916 | 1.006 |
| 0.114999999999916 | 1.007 |
| 0.119999999999916 | 1.007 |
| 0.124999999999916 | 1.008 |
| 0.129999999999916 | 1.008 |
| 0.134999999999916 | 1.009 |
| 0.139999999999916 | 1.01 |
| 0.144999999999916 | 1.01 |
| 0.149999999999916 | 1.011 |
| 0.154999999999916 | 1.012 |
| 0.159999999999916 | 1.013 |
| 0.164999999999916 | 1.014 |
| 0.169999999999916 | 1.014 |
| 0.174999999999916 | 1.015 |
| 0.179999999999916 | 1.016 |
| 0.184999999999916 | 1.017 |
| 0.189999999999916 | 1.018 |
| 0.194999999999916 | 1.019 |
| 0.199999999999916 | 1.02 |
| 0.204999999999916 | 1.021 |
| 0.209999999999916 | 1.022 |
| 0.214999999999916 | 1.023 |
| 0.219999999999916 | 1.024 |
| 0.224999999999916 | 1.025 |
| 0.229999999999916 | 1.026 |
| 0.234999999999916 | 1.027 |
| 0.239999999999916 | 1.028 |
| 0.244999999999916 | 1.03 |
| 0.249999999999916 | 1.031 |
| 0.254999999999916 | 1.032 |
| 0.259999999999916 | 1.033 |
| 0.264999999999916 | 1.035 |
| 0.269999999999916 | 1.036 |
| 0.274999999999916 | 1.037 |
| 0.279999999999916 | 1.038 |
| 0.284999999999916 | 1.04 |
| 0.289999999999916 | 1.041 |
| 0.294999999999916 | 1.043 |
| 0.299999999999916 | 1.044 |
| 0.304999999999916 | 1.045 |
| 0.309999999999916 | 1.047 |
| 0.314999999999916 | 1.048 |
| 0.319999999999916 | 1.05 |
| 0.324999999999916 | 1.051 |
| 0.329999999999916 | 1.053 |
| 0.334999999999916 | 1.055 |
| 0.339999999999916 | 1.056 |
| 0.344999999999916 | 1.058 |
| 0.349999999999916 | 1.059 |
| 0.354999999999916 | 1.061 |
| 0.359999999999916 | 1.063 |
| 0.364999999999916 | 1.065 |
| 0.369999999999916 | 1.066 |
| 0.374999999999916 | 1.068 |
| 0.379999999999916 | 1.07 |
| 0.384999999999916 | 1.072 |
| 0.389999999999916 | 1.073 |
| 0.394999999999916 | 1.075 |
| 0.399999999999916 | 1.077 |
| 0.404999999999916 | 1.079 |
| 0.409999999999916 | 1.081 |
| 0.414999999999916 | 1.083 |
| 0.419999999999916 | 1.085 |
| 0.424999999999916 | 1.087 |
| 0.429999999999916 | 1.089 |
| 0.434999999999916 | 1.091 |
| 0.439999999999916 | 1.093 |
| 0.444999999999916 | 1.095 |
| 0.449999999999916 | 1.097 |
| 0.454999999999916 | 1.099 |
| 0.459999999999916 | 1.101 |
| 0.464999999999916 | 1.103 |
| 0.469999999999916 | 1.105 |
| 0.474999999999916 | 1.107 |
| 0.479999999999916 | 1.109 |
| 0.484999999999916 | 1.111 |
| 0.489999999999916 | 1.114 |
| 0.494999999999916 | 1.116 |
| 0.499999999999916 | 1.118 |
| 0.504999999999916 | 1.12 |
| 0.509999999999916 | 1.123 |
| 0.514999999999916 | 1.125 |
| 0.519999999999916 | 1.127 |
| 0.524999999999916 | 1.129 |
| 0.529999999999916 | 1.132 |
| 0.534999999999916 | 1.134 |
| 0.539999999999916 | 1.136 |
| 0.544999999999916 | 1.139 |
| 0.549999999999916 | 1.141 |
| 0.554999999999916 | 1.144 |
| 0.559999999999916 | 1.146 |
| 0.564999999999916 | 1.149 |
| 0.569999999999916 | 1.151 |
| 0.574999999999916 | 1.154 |
| 0.579999999999916 | 1.156 |
| 0.584999999999916 | 1.159 |
| 0.589999999999916 | 1.161 |
| 0.594999999999916 | 1.164 |
| 0.599999999999916 | 1.166 |
| 0.604999999999916 | 1.169 |
| 0.609999999999916 | 1.171 |
| 0.614999999999916 | 1.174 |
| 0.619999999999916 | 1.177 |
| 0.624999999999916 | 1.179 |
| 0.629999999999916 | 1.182 |
| 0.634999999999916 | 1.185 |
| 0.639999999999916 | 1.187 |
| 0.644999999999916 | 1.19 |
| 0.649999999999916 | 1.193 |
| 0.654999999999916 | 1.195 |
| 0.659999999999916 | 1.198 |
| 0.664999999999916 | 1.201 |
| 0.669999999999916 | 1.204 |
| 0.674999999999916 | 1.206 |
| 0.679999999999916 | 1.209 |
| 0.684999999999916 | 1.212 |
| 0.689999999999916 | 1.215 |
| 0.694999999999916 | 1.218 |
| 0.699999999999916 | 1.221 |
| 0.704999999999916 | 1.224 |
| 0.709999999999916 | 1.226 |
| 0.714999999999916 | 1.229 |
| 0.719999999999916 | 1.232 |
| 0.724999999999916 | 1.235 |
| 0.729999999999916 | 1.238 |
| 0.734999999999916 | 1.241 |
| 0.739999999999916 | 1.244 |
| 0.744999999999916 | 1.247 |
| 0.749999999999916 | 1.25 |
| 0.754999999999916 | 1.253 |
| 0.759999999999916 | 1.256 |
| 0.764999999999916 | 1.259 |
| 0.769999999999916 | 1.262 |
| 0.774999999999916 | 1.265 |
| 0.779999999999916 | 1.268 |
| 0.784999999999916 | 1.271 |
| 0.789999999999916 | 1.274 |
| 0.794999999999916 | 1.278 |
| 0.799999999999916 | 1.281 |
| 0.804999999999916 | 1.284 |
| 0.809999999999916 | 1.287 |
| 0.814999999999916 | 1.29 |
| 0.819999999999916 | 1.293 |
| 0.824999999999916 | 1.296 |
| 0.829999999999916 | 1.3 |
| 0.834999999999916 | 1.303 |
| 0.839999999999916 | 1.306 |
| 0.844999999999916 | 1.309 |
| 0.849999999999916 | 1.312 |
| 0.854999999999916 | 1.316 |
| 0.859999999999916 | 1.319 |
| 0.864999999999916 | 1.322 |
| 0.869999999999916 | 1.325 |
| 0.874999999999916 | 1.329 |
| 0.879999999999916 | 1.332 |
| 0.884999999999916 | 1.335 |
| 0.889999999999916 | 1.339 |
| 0.894999999999916 | 1.342 |
| 0.899999999999916 | 1.345 |
| 0.904999999999916 | 1.349 |
| 0.909999999999916 | 1.352 |
| 0.914999999999916 | 1.355 |
| 0.919999999999916 | 1.359 |
| 0.924999999999916 | 1.362 |
| 0.929999999999916 | 1.366 |
| 0.934999999999916 | 1.369 |
| 0.939999999999916 | 1.372 |
| 0.944999999999916 | 1.376 |
| 0.949999999999916 | 1.379 |
| 0.954999999999916 | 1.383 |
| 0.959999999999916 | 1.386 |
| 0.964999999999916 | 1.39 |
| 0.969999999999916 | 1.393 |
| 0.974999999999916 | 1.397 |
| 0.979999999999916 | 1.4 |
| 0.984999999999916 | 1.404 |
| 0.989999999999916 | 1.407 |
| 0.994999999999916 | 1.411 |
| 0.999999999999916 | 1.414 |
| 1.004999999999916 | 1.418 |
| 1.009999999999916 | 1.421 |
| 1.014999999999916 | 1.425 |
| 1.019999999999916 | 1.428 |
| 1.024999999999916 | 1.432 |
| 1.029999999999916 | 1.436 |
| 1.034999999999916 | 1.439 |
| 1.039999999999915 | 1.443 |
| 1.044999999999915 | 1.446 |
| 1.049999999999915 | 1.45 |
| 1.054999999999915 | 1.454 |
| 1.059999999999915 | 1.457 |
| 1.064999999999915 | 1.461 |
| 1.069999999999915 | 1.465 |
| 1.074999999999915 | 1.468 |
| 1.079999999999915 | 1.472 |
| 1.084999999999914 | 1.476 |
| 1.089999999999914 | 1.479 |
| 1.094999999999914 | 1.483 |
| 1.099999999999914 | 1.487 |
| 1.104999999999914 | 1.49 |
| 1.109999999999914 | 1.494 |
| 1.114999999999914 | 1.498 |
| 1.119999999999914 | 1.501 |
| 1.124999999999914 | 1.505 |
| 1.129999999999914 | 1.509 |
| 1.134999999999913 | 1.513 |
| 1.139999999999913 | 1.516 |
| 1.144999999999913 | 1.52 |
| 1.149999999999913 | 1.524 |
| 1.154999999999913 | 1.528 |
| 1.159999999999913 | 1.532 |
| 1.164999999999913 | 1.535 |
| 1.169999999999913 | 1.539 |
| 1.174999999999913 | 1.543 |
| 1.179999999999912 | 1.547 |
| 1.184999999999912 | 1.551 |
| 1.189999999999912 | 1.554 |
| 1.194999999999912 | 1.558 |
| 1.199999999999912 | 1.562 |
| 1.204999999999912 | 1.566 |
| 1.209999999999912 | 1.57 |
| 1.214999999999912 | 1.574 |
| 1.219999999999912 | 1.577 |
| 1.224999999999911 | 1.581 |
| 1.229999999999911 | 1.585 |
| 1.234999999999911 | 1.589 |
| 1.239999999999911 | 1.593 |
| 1.244999999999911 | 1.597 |
| 1.249999999999911 | 1.601 |
| 1.254999999999911 | 1.605 |
| 1.259999999999911 | 1.609 |
| 1.264999999999911 | 1.613 |
| 1.269999999999911 | 1.616 |
| 1.27499999999991 | 1.62 |
| 1.27999999999991 | 1.624 |
| 1.28499999999991 | 1.628 |
| 1.28999999999991 | 1.632 |
| 1.29499999999991 | 1.636 |
| 1.29999999999991 | 1.64 |
| 1.30499999999991 | 1.644 |
| 1.30999999999991 | 1.648 |
| 1.31499999999991 | 1.652 |
| 1.319999999999909 | 1.656 |
| 1.324999999999909 | 1.66 |
| 1.329999999999909 | 1.664 |
| 1.334999999999909 | 1.668 |
| 1.339999999999909 | 1.672 |
| 1.344999999999909 | 1.676 |
| 1.349999999999909 | 1.68 |
| 1.354999999999909 | 1.684 |
| 1.359999999999909 | 1.688 |
| 1.364999999999908 | 1.692 |
| 1.369999999999908 | 1.696 |
| 1.374999999999908 | 1.7 |
| 1.379999999999908 | 1.704 |
| 1.384999999999908 | 1.708 |
| 1.389999999999908 | 1.712 |
| 1.394999999999908 | 1.716 |
| 1.399999999999908 | 1.72 |
| 1.404999999999908 | 1.725 |
| 1.409999999999908 | 1.729 |
| 1.414999999999907 | 1.733 |
| 1.419999999999907 | 1.737 |
| 1.424999999999907 | 1.741 |
| 1.429999999999907 | 1.745 |
| 1.434999999999907 | 1.749 |
| 1.439999999999907 | 1.753 |
| 1.444999999999907 | 1.757 |
| 1.449999999999907 | 1.761 |
| 1.454999999999907 | 1.766 |
| 1.459999999999906 | 1.77 |
| 1.464999999999906 | 1.774 |
| 1.469999999999906 | 1.778 |
| 1.474999999999906 | 1.782 |
| 1.479999999999906 | 1.786 |
| 1.484999999999906 | 1.79 |
| 1.489999999999906 | 1.794 |
| 1.494999999999906 | 1.799 |
| 1.499999999999906 | 1.803 |
| 1.504999999999906 | 1.807 |
| 1.509999999999905 | 1.811 |
| 1.514999999999905 | 1.815 |
| 1.519999999999905 | 1.819 |
| 1.524999999999905 | 1.824 |
| 1.529999999999905 | 1.828 |
| 1.534999999999905 | 1.832 |
| 1.539999999999905 | 1.836 |
| 1.544999999999905 | 1.84 |
| 1.549999999999905 | 1.845 |
| 1.554999999999904 | 1.849 |
| 1.559999999999904 | 1.853 |
| 1.564999999999904 | 1.857 |
| 1.569999999999904 | 1.861 |
| 1.574999999999904 | 1.866 |
| 1.579999999999904 | 1.87 |
| 1.584999999999904 | 1.874 |
| 1.589999999999904 | 1.878 |
| 1.594999999999904 | 1.883 |
| 1.599999999999903 | 1.887 |
| 1.604999999999903 | 1.891 |
| 1.609999999999903 | 1.895 |
| 1.614999999999903 | 1.9 |
| 1.619999999999903 | 1.904 |
| 1.624999999999903 | 1.908 |
| 1.629999999999903 | 1.912 |
| 1.634999999999903 | 1.917 |
| 1.639999999999903 | 1.921 |
| 1.644999999999902 | 1.925 |
| 1.649999999999902 | 1.929 |
| 1.654999999999902 | 1.934 |
| 1.659999999999902 | 1.938 |
| 1.664999999999902 | 1.942 |
| 1.669999999999902 | 1.947 |
| 1.674999999999902 | 1.951 |
| 1.679999999999902 | 1.955 |
| 1.684999999999902 | 1.959 |
| 1.689999999999901 | 1.964 |
| 1.694999999999901 | 1.968 |
| 1.699999999999901 | 1.972 |
| 1.704999999999901 | 1.977 |
| 1.709999999999901 | 1.981 |
| 1.714999999999901 | 1.985 |
| 1.719999999999901 | 1.99 |
| 1.724999999999901 | 1.994 |
| 1.729999999999901 | 1.998 |
| 1.734999999999901 | 2.003 |
| 1.7399999999999 | 2.007 |
| 1.7449999999999 | 2.011 |
| 1.7499999999999 | 2.016 |
| 1.7549999999999 | 2.02 |
| 1.7599999999999 | 2.024 |
| 1.7649999999999 | 2.029 |
| 1.7699999999999 | 2.033 |
| 1.7749999999999 | 2.037 |
| 1.7799999999999 | 2.042 |
| 1.784999999999899 | 2.046 |
| 1.789999999999899 | 2.05 |
| 1.794999999999899 | 2.055 |
| 1.799999999999899 | 2.059 |
| 1.804999999999899 | 2.063 |
| 1.809999999999899 | 2.068 |
| 1.814999999999899 | 2.072 |
| 1.819999999999899 | 2.077 |
| 1.824999999999899 | 2.081 |
| 1.829999999999899 | 2.085 |
| 1.834999999999898 | 2.09 |
| 1.839999999999898 | 2.094 |
| 1.844999999999898 | 2.099 |
| 1.849999999999898 | 2.103 |
| 1.854999999999898 | 2.107 |
| 1.859999999999898 | 2.112 |
| 1.864999999999898 | 2.116 |
| 1.869999999999898 | 2.121 |
| 1.874999999999898 | 2.125 |
| 1.879999999999897 | 2.129 |
| 1.884999999999897 | 2.134 |
| 1.889999999999897 | 2.138 |
| 1.894999999999897 | 2.143 |
| 1.899999999999897 | 2.147 |
| 1.904999999999897 | 2.152 |
| 1.909999999999897 | 2.156 |
| 1.914999999999897 | 2.16 |
| 1.919999999999897 | 2.165 |
| 1.924999999999897 | 2.169 |
| 1.929999999999896 | 2.174 |
| 1.934999999999896 | 2.178 |
| 1.939999999999896 | 2.183 |
| 1.944999999999896 | 2.187 |
| 1.949999999999896 | 2.191 |
| 1.954999999999896 | 2.196 |
| 1.959999999999896 | 2.2 |
| 1.964999999999896 | 2.205 |
| 1.969999999999896 | 2.209 |
| 1.974999999999895 | 2.214 |
| 1.979999999999895 | 2.218 |
| 1.984999999999895 | 2.223 |
| 1.989999999999895 | 2.227 |
| 1.994999999999895 | 2.232 |
| 1.999999999999895 | 2.236 |
| 2.004999999999895 | 2.241 |
| 2.009999999999895 | 2.245 |
| 2.014999999999895 | 2.249 |
| 2.019999999999895 | 2.254 |
| 2.024999999999895 | 2.258 |
| 2.029999999999895 | 2.263 |
| 2.034999999999894 | 2.267 |
| 2.039999999999894 | 2.272 |
| 2.044999999999894 | 2.276 |
| 2.049999999999894 | 2.281 |
| 2.054999999999894 | 2.285 |
| 2.059999999999894 | 2.29 |
| 2.064999999999894 | 2.294 |
| 2.069999999999894 | 2.299 |
| 2.074999999999894 | 2.303 |
| 2.079999999999893 | 2.308 |
| 2.084999999999893 | 2.312 |
| 2.089999999999893 | 2.317 |
| 2.094999999999893 | 2.321 |
| 2.099999999999893 | 2.326 |
| 2.104999999999893 | 2.33 |
| 2.109999999999893 | 2.335 |
| 2.114999999999893 | 2.339 |
| 2.119999999999893 | 2.344 |
| 2.124999999999893 | 2.349 |
| 2.129999999999892 | 2.353 |
| 2.134999999999892 | 2.358 |
| 2.139999999999892 | 2.362 |
| 2.144999999999892 | 2.367 |
| 2.149999999999892 | 2.371 |
| 2.154999999999892 | 2.376 |
| 2.159999999999892 | 2.38 |
| 2.164999999999892 | 2.385 |
| 2.169999999999892 | 2.389 |
| 2.174999999999891 | 2.394 |
| 2.179999999999891 | 2.398 |
| 2.184999999999891 | 2.403 |
| 2.189999999999891 | 2.408 |
| 2.194999999999891 | 2.412 |
| 2.199999999999891 | 2.417 |
| 2.204999999999891 | 2.421 |
| 2.209999999999891 | 2.426 |
| 2.214999999999891 | 2.43 |
| 2.21999999999989 | 2.435 |
| 2.22499999999989 | 2.439 |
| 2.22999999999989 | 2.444 |
| 2.23499999999989 | 2.449 |
| 2.23999999999989 | 2.453 |
| 2.24499999999989 | 2.458 |
| 2.24999999999989 | 2.462 |
| 2.25499999999989 | 2.467 |
| 2.25999999999989 | 2.471 |
| 2.26499999999989 | 2.476 |
| 2.269999999999889 | 2.481 |
| 2.274999999999889 | 2.485 |
| 2.279999999999889 | 2.49 |
| 2.284999999999889 | 2.494 |
| 2.289999999999889 | 2.499 |
| 2.294999999999889 | 2.503 |
| 2.299999999999889 | 2.508 |
| 2.304999999999889 | 2.513 |
| 2.309999999999889 | 2.517 |
| 2.314999999999888 | 2.522 |
| 2.319999999999888 | 2.526 |
| 2.324999999999888 | 2.531 |
| 2.329999999999888 | 2.536 |
| 2.334999999999888 | 2.54 |
| 2.339999999999888 | 2.545 |
| 2.344999999999888 | 2.549 |
| 2.349999999999888 | 2.554 |
| 2.354999999999888 | 2.559 |
| 2.359999999999887 | 2.563 |
| 2.364999999999887 | 2.568 |
| 2.369999999999887 | 2.572 |
| 2.374999999999887 | 2.577 |
| 2.379999999999887 | 2.582 |
| 2.384999999999887 | 2.586 |
| 2.389999999999887 | 2.591 |
| 2.394999999999887 | 2.595 |
| 2.399999999999887 | 2.6 |
| 2.404999999999887 | 2.605 |
| 2.409999999999886 | 2.609 |
| 2.414999999999886 | 2.614 |
| 2.419999999999886 | 2.618 |
| 2.424999999999886 | 2.623 |
| 2.429999999999886 | 2.628 |
| 2.434999999999886 | 2.632 |
| 2.439999999999886 | 2.637 |
| 2.444999999999886 | 2.642 |
| 2.449999999999886 | 2.646 |
| 2.454999999999885 | 2.651 |
| 2.459999999999885 | 2.655 |
| 2.464999999999885 | 2.66 |
| 2.469999999999885 | 2.665 |
| 2.474999999999885 | 2.669 |
| 2.479999999999885 | 2.674 |
| 2.484999999999885 | 2.679 |
| 2.489999999999885 | 2.683 |
| 2.494999999999885 | 2.688 |
| 2.499999999999884 | 2.693 |
| 2.504999999999884 | 2.697 |
| 2.509999999999884 | 2.702 |
| 2.514999999999884 | 2.707 |
| 2.519999999999884 | 2.711 |
| 2.524999999999884 | 2.716 |
| 2.529999999999884 | 2.72 |
| 2.534999999999884 | 2.725 |
| 2.539999999999884 | 2.73 |
| 2.544999999999884 | 2.734 |
| 2.549999999999883 | 2.739 |
| 2.554999999999883 | 2.744 |
| 2.559999999999883 | 2.748 |
| 2.564999999999883 | 2.753 |
| 2.569999999999883 | 2.758 |
| 2.574999999999883 | 2.762 |
| 2.579999999999883 | 2.767 |
| 2.584999999999883 | 2.772 |
| 2.589999999999883 | 2.776 |
| 2.594999999999882 | 2.781 |
| 2.599999999999882 | 2.786 |
| 2.604999999999882 | 2.79 |
| 2.609999999999882 | 2.795 |
| 2.614999999999882 | 2.8 |
| 2.619999999999882 | 2.804 |
| 2.624999999999882 | 2.809 |
| 2.629999999999882 | 2.814 |
| 2.634999999999882 | 2.818 |
| 2.639999999999881 | 2.823 |
| 2.644999999999881 | 2.828 |
| 2.649999999999881 | 2.832 |
| 2.654999999999881 | 2.837 |
| 2.659999999999881 | 2.842 |
| 2.664999999999881 | 2.846 |
| 2.669999999999881 | 2.851 |
| 2.674999999999881 | 2.856 |
| 2.679999999999881 | 2.86 |
| 2.68499999999988 | 2.865 |
| 2.68999999999988 | 2.87 |
| 2.69499999999988 | 2.875 |
| 2.69999999999988 | 2.879 |
| 2.70499999999988 | 2.884 |
| 2.70999999999988 | 2.889 |
| 2.71499999999988 | 2.893 |
| 2.71999999999988 | 2.898 |
| 2.72499999999988 | 2.903 |
| 2.72999999999988 | 2.907 |
| 2.734999999999879 | 2.912 |
| 2.739999999999879 | 2.917 |
| 2.744999999999879 | 2.921 |
| 2.749999999999879 | 2.926 |
| 2.754999999999879 | 2.931 |
| 2.759999999999879 | 2.936 |
| 2.764999999999879 | 2.94 |
| 2.769999999999879 | 2.945 |
| 2.774999999999879 | 2.95 |
| 2.779999999999878 | 2.954 |
| 2.784999999999878 | 2.959 |
| 2.789999999999878 | 2.964 |
| 2.794999999999878 | 2.969 |
| 2.799999999999878 | 2.973 |
| 2.804999999999878 | 2.978 |
| 2.809999999999878 | 2.983 |
| 2.814999999999878 | 2.987 |
| 2.819999999999878 | 2.992 |
| 2.824999999999878 | 2.997 |
| 2.829999999999877 | 3.001 |
| 2.834999999999877 | 3.006 |
| 2.839999999999877 | 3.011 |
| 2.844999999999877 | 3.016 |
| 2.849999999999877 | 3.02 |
| 2.854999999999877 | 3.025 |
| 2.859999999999877 | 3.03 |
| 2.864999999999877 | 3.035 |
| 2.869999999999877 | 3.039 |
| 2.874999999999876 | 3.044 |
| 2.879999999999876 | 3.049 |
| 2.884999999999876 | 3.053 |
| 2.889999999999876 | 3.058 |
| 2.894999999999876 | 3.063 |
| 2.899999999999876 | 3.068 |
| 2.904999999999876 | 3.072 |
| 2.909999999999876 | 3.077 |
| 2.914999999999876 | 3.082 |
| 2.919999999999876 | 3.086 |
| 2.924999999999875 | 3.091 |
| 2.929999999999875 | 3.096 |
| 2.934999999999875 | 3.101 |
| 2.939999999999875 | 3.105 |
| 2.944999999999875 | 3.11 |
| 2.949999999999875 | 3.115 |
| 2.954999999999875 | 3.12 |
| 2.959999999999875 | 3.124 |
| 2.964999999999875 | 3.129 |
| 2.969999999999874 | 3.134 |
| 2.974999999999874 | 3.139 |
| 2.979999999999874 | 3.143 |
| 2.984999999999874 | 3.148 |
| 2.989999999999874 | 3.153 |
| 2.994999999999874 | 3.158 |
| 2.999999999999874 | 3.162 |
| 3.004999999999874 | 3.167 |
| 3.009999999999874 | 3.172 |
| 3.014999999999874 | 3.177 |
| 3.019999999999873 | 3.181 |
| 3.024999999999873 | 3.186 |
| 3.029999999999873 | 3.191 |
| 3.034999999999873 | 3.196 |
| 3.039999999999873 | 3.2 |
| 3.044999999999873 | 3.205 |
| 3.049999999999873 | 3.21 |
| 3.054999999999873 | 3.215 |
| 3.059999999999873 | 3.219 |
| 3.064999999999872 | 3.224 |
| 3.069999999999872 | 3.229 |
| 3.074999999999872 | 3.234 |
| 3.079999999999872 | 3.238 |
| 3.084999999999872 | 3.243 |
| 3.089999999999872 | 3.248 |
| 3.094999999999872 | 3.253 |
| 3.099999999999872 | 3.257 |
| 3.104999999999872 | 3.262 |
| 3.109999999999872 | 3.267 |
| 3.114999999999871 | 3.272 |
| 3.119999999999871 | 3.276 |
| 3.124999999999871 | 3.281 |
| 3.129999999999871 | 3.286 |
| 3.134999999999871 | 3.291 |
| 3.139999999999871 | 3.295 |
| 3.144999999999871 | 3.3 |
| 3.149999999999871 | 3.305 |
| 3.154999999999871 | 3.31 |
| 3.15999999999987 | 3.314 |
| 3.16499999999987 | 3.319 |
| 3.16999999999987 | 3.324 |
| 3.17499999999987 | 3.329 |
| 3.17999999999987 | 3.334 |
| 3.18499999999987 | 3.338 |
| 3.18999999999987 | 3.343 |
| 3.19499999999987 | 3.348 |
| 3.19999999999987 | 3.353 |
| 3.204999999999869 | 3.357 |
| 3.209999999999869 | 3.362 |
| 3.214999999999869 | 3.367 |
| 3.219999999999869 | 3.372 |
| 3.224999999999869 | 3.376 |
| 3.229999999999869 | 3.381 |
| 3.234999999999869 | 3.386 |
| 3.239999999999869 | 3.391 |
| 3.244999999999869 | 3.396 |
| 3.249999999999869 | 3.4 |
| 3.254999999999868 | 3.405 |
| 3.259999999999868 | 3.41 |
| 3.264999999999868 | 3.415 |
| 3.269999999999868 | 3.419 |
| 3.274999999999868 | 3.424 |
| 3.279999999999868 | 3.429 |
| 3.284999999999868 | 3.434 |
| 3.289999999999868 | 3.439 |
| 3.294999999999868 | 3.443 |
| 3.299999999999867 | 3.448 |
| 3.304999999999867 | 3.453 |
| 3.309999999999867 | 3.458 |
| 3.314999999999867 | 3.463 |
| 3.319999999999867 | 3.467 |
| 3.324999999999867 | 3.472 |
| 3.329999999999867 | 3.477 |
| 3.334999999999867 | 3.482 |
| 3.339999999999867 | 3.486 |
| 3.344999999999866 | 3.491 |
| 3.349999999999866 | 3.496 |
| 3.354999999999866 | 3.501 |
| 3.359999999999866 | 3.506 |
| 3.364999999999866 | 3.51 |
| 3.369999999999866 | 3.515 |
| 3.374999999999866 | 3.52 |
| 3.379999999999866 | 3.525 |
| 3.384999999999866 | 3.53 |
| 3.389999999999866 | 3.534 |
| 3.394999999999865 | 3.539 |
| 3.399999999999865 | 3.544 |
| 3.404999999999865 | 3.549 |
| 3.409999999999865 | 3.554 |
| 3.414999999999865 | 3.558 |
| 3.419999999999865 | 3.563 |
| 3.424999999999865 | 3.568 |
| 3.429999999999865 | 3.573 |
| 3.434999999999865 | 3.578 |
| 3.439999999999864 | 3.582 |
| 3.444999999999864 | 3.587 |
| 3.449999999999864 | 3.592 |
| 3.454999999999864 | 3.597 |
| 3.459999999999864 | 3.602 |
| 3.464999999999864 | 3.606 |
| 3.469999999999864 | 3.611 |
| 3.474999999999864 | 3.616 |
| 3.479999999999864 | 3.621 |
| 3.484999999999864 | 3.626 |
| 3.489999999999863 | 3.63 |
| 3.494999999999863 | 3.635 |
| 3.499999999999863 | 3.64 |
| 3.504999999999863 | 3.645 |
| 3.509999999999863 | 3.65 |
| 3.514999999999863 | 3.654 |
| 3.519999999999863 | 3.659 |
| 3.524999999999863 | 3.664 |
| 3.529999999999863 | 3.669 |
| 3.534999999999862 | 3.674 |
| 3.539999999999862 | 3.679 |
| 3.544999999999862 | 3.683 |
| 3.549999999999862 | 3.688 |
| 3.554999999999862 | 3.693 |
| 3.559999999999862 | 3.698 |
| 3.564999999999862 | 3.703 |
| 3.569999999999862 | 3.707 |
| 3.574999999999862 | 3.712 |
| 3.579999999999862 | 3.717 |
| 3.584999999999861 | 3.722 |
| 3.589999999999861 | 3.727 |
| 3.594999999999861 | 3.731 |
| 3.599999999999861 | 3.736 |
| 3.604999999999861 | 3.741 |
| 3.609999999999861 | 3.746 |
| 3.614999999999861 | 3.751 |
| 3.619999999999861 | 3.756 |
| 3.62499999999986 | 3.76 |
| 3.62999999999986 | 3.765 |
| 3.63499999999986 | 3.77 |
| 3.63999999999986 | 3.775 |
| 3.64499999999986 | 3.78 |
| 3.64999999999986 | 3.785 |
| 3.65499999999986 | 3.789 |
| 3.65999999999986 | 3.794 |
| 3.66499999999986 | 3.799 |
| 3.669999999999859 | 3.804 |
| 3.674999999999859 | 3.809 |
| 3.679999999999859 | 3.813 |
| 3.684999999999859 | 3.818 |
| 3.689999999999859 | 3.823 |
| 3.694999999999859 | 3.828 |
| 3.699999999999859 | 3.833 |
| 3.704999999999859 | 3.838 |
| 3.709999999999859 | 3.842 |
| 3.714999999999859 | 3.847 |
| 3.719999999999858 | 3.852 |
| 3.724999999999858 | 3.857 |
| 3.729999999999858 | 3.862 |
| 3.734999999999858 | 3.867 |
| 3.739999999999858 | 3.871 |
| 3.744999999999858 | 3.876 |
| 3.749999999999858 | 3.881 |
| 3.754999999999858 | 3.886 |
| 3.759999999999858 | 3.891 |
| 3.764999999999857 | 3.896 |
| 3.769999999999857 | 3.9 |
| 3.774999999999857 | 3.905 |
| 3.779999999999857 | 3.91 |
| 3.784999999999857 | 3.915 |
| 3.789999999999857 | 3.92 |
| 3.794999999999857 | 3.925 |
| 3.799999999999857 | 3.929 |
| 3.804999999999857 | 3.934 |
| 3.809999999999857 | 3.939 |
| 3.814999999999856 | 3.944 |
| 3.819999999999856 | 3.949 |
| 3.824999999999856 | 3.954 |
| 3.829999999999856 | 3.958 |
| 3.834999999999856 | 3.963 |
| 3.839999999999856 | 3.968 |
| 3.844999999999856 | 3.973 |
| 3.849999999999856 | 3.978 |
| 3.854999999999856 | 3.983 |
| 3.859999999999855 | 3.987 |
| 3.864999999999855 | 3.992 |
| 3.869999999999855 | 3.997 |
| 3.874999999999855 | 4.002 |
| 3.879999999999855 | 4.007 |
| 3.884999999999855 | 4.012 |
| 3.889999999999855 | 4.016 |
| 3.894999999999855 | 4.021 |
| 3.899999999999855 | 4.026 |
| 3.904999999999855 | 4.031 |
| 3.909999999999854 | 4.036 |
| 3.914999999999854 | 4.041 |
| 3.919999999999854 | 4.046 |
| 3.924999999999854 | 4.05 |
| 3.929999999999854 | 4.055 |
| 3.934999999999854 | 4.06 |
| 3.939999999999854 | 4.065 |
| 3.944999999999854 | 4.07 |
| 3.949999999999854 | 4.075 |
| 3.954999999999853 | 4.079 |
| 3.959999999999853 | 4.084 |
| 3.964999999999853 | 4.089 |
| 3.969999999999853 | 4.094 |
| 3.974999999999853 | 4.099 |
| 3.979999999999853 | 4.104 |
| 3.984999999999853 | 4.109 |
| 3.989999999999853 | 4.113 |
| 3.994999999999853 | 4.118 |
| 3.999999999999853 | 4.123 |
| 4.004999999999852 | 4.128 |
| 4.009999999999852 | 4.133 |
| 4.014999999999852 | 4.138 |
| 4.019999999999852 | 4.143 |
| 4.024999999999852 | 4.147 |
| 4.029999999999852 | 4.152 |
| 4.034999999999852 | 4.157 |
| 4.039999999999851 | 4.162 |
| 4.044999999999852 | 4.167 |
| 4.049999999999851 | 4.172 |
| 4.054999999999851 | 4.176 |
| 4.059999999999851 | 4.181 |
| 4.064999999999851 | 4.186 |
| 4.069999999999851 | 4.191 |
| 4.074999999999851 | 4.196 |
| 4.07999999999985 | 4.201 |
| 4.084999999999851 | 4.206 |
| 4.08999999999985 | 4.21 |
| 4.094999999999851 | 4.215 |
| 4.09999999999985 | 4.22 |
| 4.10499999999985 | 4.225 |
| 4.10999999999985 | 4.23 |
| 4.11499999999985 | 4.235 |
| 4.11999999999985 | 4.24 |
| 4.12499999999985 | 4.244 |
| 4.12999999999985 | 4.249 |
| 4.13499999999985 | 4.254 |
| 4.13999999999985 | 4.259 |
| 4.144999999999849 | 4.264 |
| 4.14999999999985 | 4.269 |
| 4.154999999999849 | 4.274 |
| 4.15999999999985 | 4.279 |
| 4.164999999999849 | 4.283 |
| 4.169999999999849 | 4.288 |
| 4.174999999999849 | 4.293 |
| 4.179999999999848 | 4.298 |
| 4.184999999999849 | 4.303 |
| 4.189999999999848 | 4.308 |
| 4.194999999999848 | 4.313 |
| 4.199999999999848 | 4.317 |
| 4.204999999999848 | 4.322 |
| 4.209999999999848 | 4.327 |
| 4.214999999999848 | 4.332 |
| 4.219999999999847 | 4.337 |
| 4.224999999999848 | 4.342 |
| 4.229999999999847 | 4.347 |
| 4.234999999999847 | 4.351 |
| 4.239999999999847 | 4.356 |
| 4.244999999999847 | 4.361 |
| 4.249999999999847 | 4.366 |
| 4.254999999999847 | 4.371 |
| 4.259999999999846 | 4.376 |
| 4.264999999999847 | 4.381 |
| 4.269999999999846 | 4.386 |
| 4.274999999999846 | 4.39 |
| 4.279999999999846 | 4.395 |
| 4.284999999999846 | 4.4 |
| 4.289999999999846 | 4.405 |
| 4.294999999999846 | 4.41 |
| 4.299999999999846 | 4.415 |
| 4.304999999999846 | 4.42 |
| 4.309999999999845 | 4.424 |
| 4.314999999999846 | 4.429 |
| 4.319999999999845 | 4.434 |
| 4.324999999999846 | 4.439 |
| 4.329999999999845 | 4.444 |
| 4.334999999999845 | 4.449 |
| 4.339999999999845 | 4.454 |
| 4.344999999999845 | 4.459 |
| 4.349999999999845 | 4.463 |
| 4.354999999999845 | 4.468 |
| 4.359999999999844 | 4.473 |
| 4.364999999999845 | 4.478 |
| 4.369999999999844 | 4.483 |
| 4.374999999999844 | 4.488 |
| 4.379999999999844 | 4.493 |
| 4.384999999999844 | 4.498 |
| 4.389999999999844 | 4.502 |
| 4.394999999999844 | 4.507 |
| 4.399999999999844 | 4.512 |
| 4.404999999999844 | 4.517 |
| 4.409999999999843 | 4.522 |
| 4.414999999999844 | 4.527 |
| 4.419999999999843 | 4.532 |
| 4.424999999999843 | 4.537 |
| 4.429999999999843 | 4.541 |
| 4.434999999999843 | 4.546 |
| 4.439999999999843 | 4.551 |
| 4.444999999999843 | 4.556 |
| 4.449999999999842 | 4.561 |
| 4.454999999999843 | 4.566 |
| 4.459999999999842 | 4.571 |
| 4.464999999999843 | 4.576 |
| 4.469999999999842 | 4.58 |
| 4.474999999999842 | 4.585 |
| 4.479999999999842 | 4.59 |
| 4.484999999999842 | 4.595 |
| 4.489999999999842 | 4.6 |
| 4.494999999999842 | 4.605 |
| 4.499999999999841 | 4.61 |
| 4.504999999999842 | 4.615 |
| 4.509999999999841 | 4.62 |
| 4.514999999999842 | 4.624 |
| 4.519999999999841 | 4.629 |
| 4.524999999999841 | 4.634 |
| 4.529999999999841 | 4.639 |
| 4.534999999999841 | 4.644 |
| 4.53999999999984 | 4.649 |
| 4.544999999999841 | 4.654 |
| 4.54999999999984 | 4.659 |
| 4.554999999999841 | 4.663 |
| 4.55999999999984 | 4.668 |
| 4.564999999999841 | 4.673 |
| 4.56999999999984 | 4.678 |
| 4.57499999999984 | 4.683 |
| 4.57999999999984 | 4.688 |
| 4.58499999999984 | 4.693 |
| 4.58999999999984 | 4.698 |
| 4.59499999999984 | 4.703 |
| 4.59999999999984 | 4.707 |
| 4.60499999999984 | 4.712 |
| 4.60999999999984 | 4.717 |
| 4.614999999999839 | 4.722 |
| 4.61999999999984 | 4.727 |
| 4.624999999999839 | 4.732 |
| 4.62999999999984 | 4.737 |
| 4.634999999999839 | 4.742 |
| 4.639999999999838 | 4.747 |
| 4.644999999999839 | 4.751 |
| 4.649999999999838 | 4.756 |
| 4.654999999999839 | 4.761 |
| 4.659999999999838 | 4.766 |
| 4.664999999999838 | 4.771 |
| 4.669999999999838 | 4.776 |
| 4.674999999999838 | 4.781 |
| 4.679999999999837 | 4.786 |
| 4.684999999999838 | 4.791 |
| 4.689999999999837 | 4.795 |
| 4.694999999999838 | 4.8 |
| 4.699999999999837 | 4.805 |
| 4.704999999999837 | 4.81 |
| 4.709999999999837 | 4.815 |
| 4.714999999999837 | 4.82 |
| 4.719999999999837 | 4.825 |
| 4.724999999999837 | 4.83 |
| 4.729999999999836 | 4.835 |
| 4.734999999999836 | 4.839 |
| 4.739999999999836 | 4.844 |
| 4.744999999999836 | 4.849 |
| 4.749999999999836 | 4.854 |
| 4.754999999999836 | 4.859 |
| 4.759999999999836 | 4.864 |
| 4.764999999999836 | 4.869 |
| 4.769999999999836 | 4.874 |
| 4.774999999999835 | 4.879 |
| 4.779999999999835 | 4.883 |
| 4.784999999999835 | 4.888 |
| 4.789999999999835 | 4.893 |
| 4.794999999999835 | 4.898 |
| 4.799999999999835 | 4.903 |
| 4.804999999999835 | 4.908 |
| 4.809999999999835 | 4.913 |
| 4.814999999999835 | 4.918 |
| 4.819999999999835 | 4.923 |
| 4.824999999999835 | 4.928 |
| 4.829999999999834 | 4.932 |
| 4.834999999999834 | 4.937 |
| 4.839999999999834 | 4.942 |
| 4.844999999999834 | 4.947 |
| 4.849999999999834 | 4.952 |
| 4.854999999999834 | 4.957 |
| 4.859999999999834 | 4.962 |
| 4.864999999999834 | 4.967 |
| 4.869999999999834 | 4.972 |
| 4.874999999999834 | 4.977 |
| 4.879999999999833 | 4.981 |
| 4.884999999999834 | 4.986 |
| 4.889999999999833 | 4.991 |
| 4.894999999999833 | 4.996 |
| 4.899999999999833 | 5.001 |
| 4.904999999999833 | 5.006 |
| 4.909999999999833 | 5.011 |
| 4.914999999999833 | 5.016 |
| 4.919999999999832 | 5.021 |
| 4.924999999999833 | 5.025 |
| 4.929999999999832 | 5.03 |
| 4.934999999999832 | 5.035 |
| 4.939999999999832 | 5.04 |
| 4.944999999999832 | 5.045 |
| 4.949999999999832 | 5.05 |
| 4.954999999999832 | 5.055 |
| 4.959999999999832 | 5.06 |
| 4.964999999999832 | 5.065 |
| 4.969999999999831 | 5.07 |
| 4.974999999999831 | 5.075 |
| 4.97999999999983 | 5.079 |
| 4.984999999999831 | 5.084 |
| 4.98999999999983 | 5.089 |
| 4.994999999999831 | 5.094 |
| 4.99999999999983 | 5.099 |